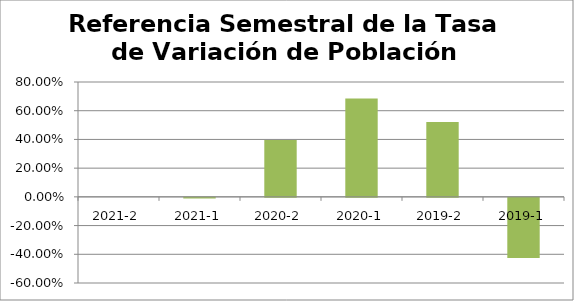
| Category | Referencia Semestral de la Tasa de Variación de Población Atendida |
|---|---|
| 2021-2 | 0 |
| 2021-1 | -0.005 |
| 2020-2 | 0.397 |
| 2020-1 | 0.685 |
| 2019-2 | 0.521 |
| 2019-1 | -0.419 |